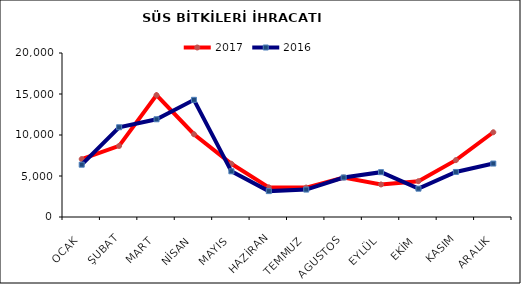
| Category | 2017 | 2016 |
|---|---|---|
| OCAK | 7065.887 | 6380.197 |
| ŞUBAT | 8665.687 | 10943.895 |
| MART | 14861.444 | 11918.692 |
| NİSAN | 10094.82 | 14289.864 |
| MAYIS | 6492.509 | 5571.91 |
| HAZİRAN | 3619.612 | 3156.903 |
| TEMMUZ | 3589.188 | 3344.216 |
| AGUSTOS | 4815.23 | 4817.886 |
| EYLÜL | 3969.217 | 5467.372 |
| EKİM | 4366.209 | 3457.194 |
| KASIM | 6933.812 | 5491.641 |
| ARALIK | 10334.591 | 6517.146 |